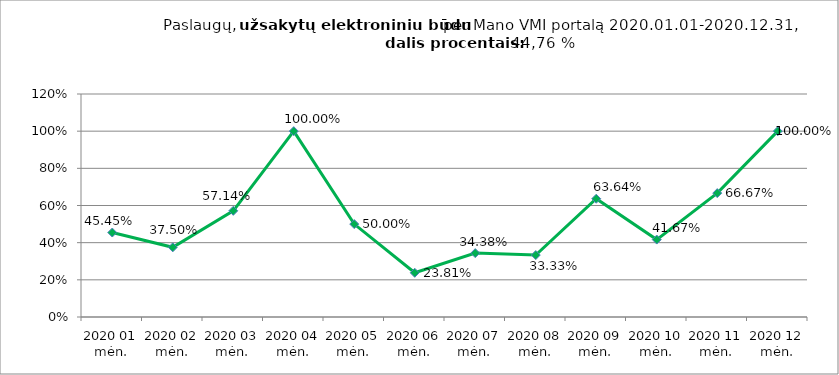
| Category | Elektroniniu būdu užsakytų paslaugų dalis procentais (lyginant su visomis Mano VMI portale užsakytomis paslaugomis) |
|---|---|
| 2020 01 mėn. | 0.455 |
| 2020 02 mėn. | 0.375 |
| 2020 03 mėn. | 0.571 |
| 2020 04 mėn. | 1 |
| 2020 05 mėn. | 0.5 |
| 2020 06 mėn. | 0.238 |
| 2020 07 mėn. | 0.344 |
| 2020 08 mėn. | 0.333 |
| 2020 09 mėn. | 0.636 |
| 2020 10 mėn. | 0.417 |
| 2020 11 mėn. | 0.667 |
| 2020 12 mėn. | 1 |